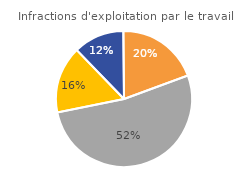
| Category | Infractions d'exploitation par le travail |
|---|---|
| Instruction | 12.073 |
| COPJ* | 19.533 |
| Comparution immédiate | 52.449 |
| Autres | 15.945 |